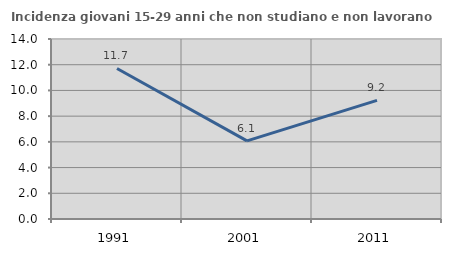
| Category | Incidenza giovani 15-29 anni che non studiano e non lavorano  |
|---|---|
| 1991.0 | 11.707 |
| 2001.0 | 6.072 |
| 2011.0 | 9.224 |